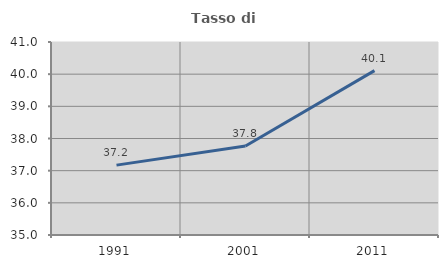
| Category | Tasso di occupazione   |
|---|---|
| 1991.0 | 37.173 |
| 2001.0 | 37.766 |
| 2011.0 | 40.11 |